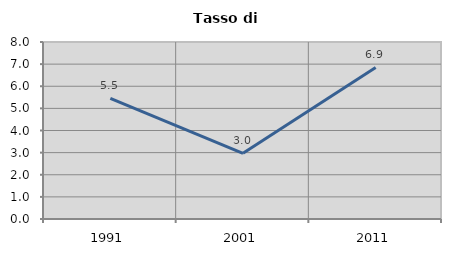
| Category | Tasso di disoccupazione   |
|---|---|
| 1991.0 | 5.456 |
| 2001.0 | 2.97 |
| 2011.0 | 6.851 |